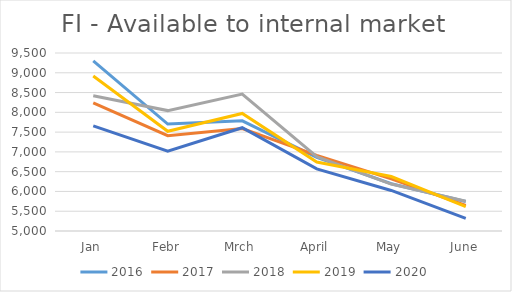
| Category | 2016 | 2017 | 2018 | 2019 | 2020 |
|---|---|---|---|---|---|
| Jan | 9303 | 8240 | 8417 | 8918 | 7657.304 |
| Febr | 7703 | 7411 | 8044 | 7520 | 7015.868 |
| Mrch | 7786 | 7589 | 8460 | 7972 | 7610.403 |
| April | 6860 | 6912 | 6881 | 6745 | 6570.248 |
| May | 6195 | 6319 | 6187 | 6378 | 6025.095 |
| June | 5745 | 5649 | 5750 | 5616 | 5317.189 |